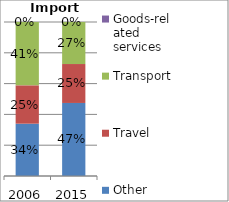
| Category | Other commercial services | Travel | Transport | Goods-related services |
|---|---|---|---|---|
| 2006.0 | 0.34 | 0.249 | 0.411 |  |
| 2015.0 | 0.474 | 0.253 | 0.273 |  |